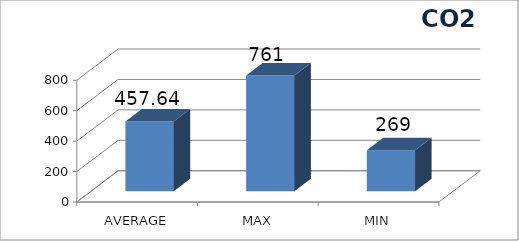
| Category | Series 0 |
|---|---|
| AVERAGE | 457.64 |
| MAX | 761 |
| MIN | 269 |